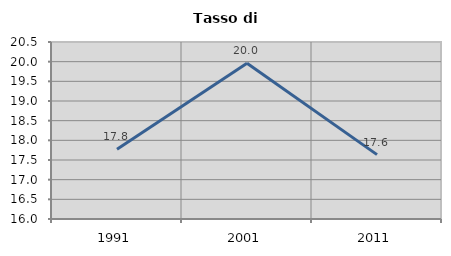
| Category | Tasso di disoccupazione   |
|---|---|
| 1991.0 | 17.772 |
| 2001.0 | 19.958 |
| 2011.0 | 17.637 |